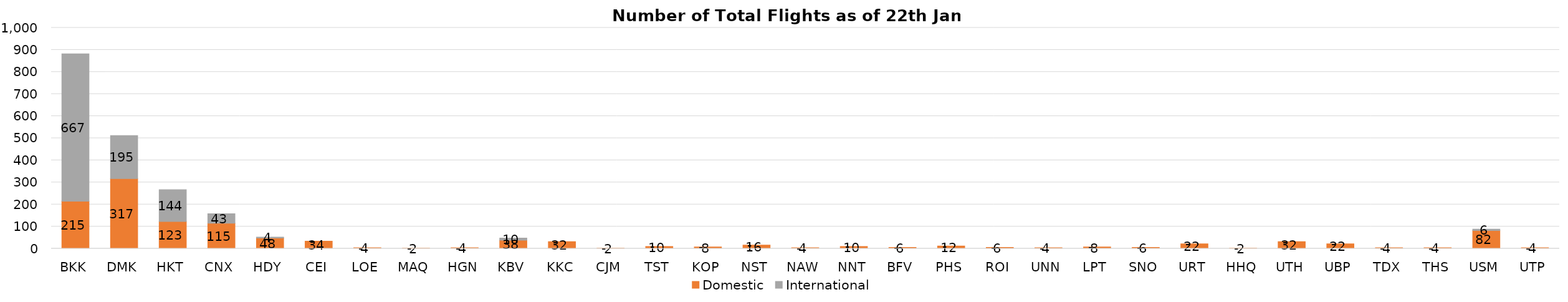
| Category | Domestic | International |
|---|---|---|
| BKK | 215 | 667 |
| DMK | 317 | 195 |
| HKT | 123 | 144 |
| CNX | 115 | 43 |
| HDY | 48 | 4 |
| CEI | 34 | 0 |
| LOE | 4 | 0 |
| MAQ | 2 | 0 |
| HGN | 4 | 0 |
| KBV | 38 | 10 |
| KKC | 32 | 0 |
| CJM | 2 | 0 |
| TST | 10 | 0 |
| KOP | 8 | 0 |
| NST | 16 | 0 |
| NAW | 4 | 0 |
| NNT | 10 | 0 |
| BFV | 6 | 0 |
| PHS | 12 | 0 |
| ROI | 6 | 0 |
| UNN | 4 | 0 |
| LPT | 8 | 0 |
| SNO | 6 | 0 |
| URT | 22 | 0 |
| HHQ | 2 | 0 |
| UTH | 32 | 0 |
| UBP | 22 | 0 |
| TDX | 4 | 0 |
| THS | 4 | 0 |
| USM | 82 | 6 |
| UTP | 4 | 0 |